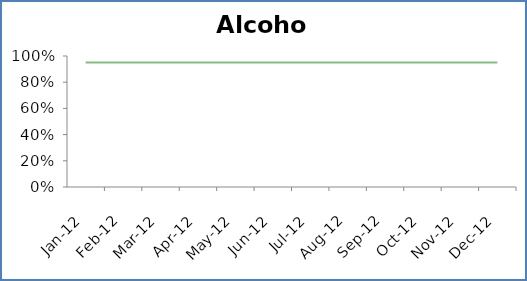
| Category | Alcohol | Goal |
|---|---|---|
| 2012-01-01 | 0 | 0.95 |
| 2012-02-01 | 0 | 0.95 |
| 2012-03-01 | 0 | 0.95 |
| 2012-04-01 | 0 | 0.95 |
| 2012-05-01 | 0 | 0.95 |
| 2012-06-01 | 0 | 0.95 |
| 2012-07-01 | 0 | 0.95 |
| 2012-08-01 | 0 | 0.95 |
| 2012-09-01 | 0 | 0.95 |
| 2012-10-01 | 0 | 0.95 |
| 2012-11-01 | 0 | 0.95 |
| 2012-12-01 | 0 | 0.95 |